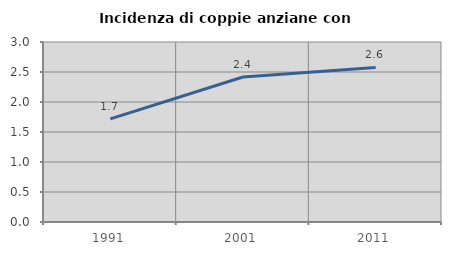
| Category | Incidenza di coppie anziane con figli |
|---|---|
| 1991.0 | 1.718 |
| 2001.0 | 2.417 |
| 2011.0 | 2.577 |